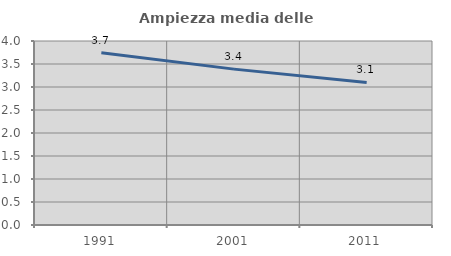
| Category | Ampiezza media delle famiglie |
|---|---|
| 1991.0 | 3.743 |
| 2001.0 | 3.389 |
| 2011.0 | 3.1 |